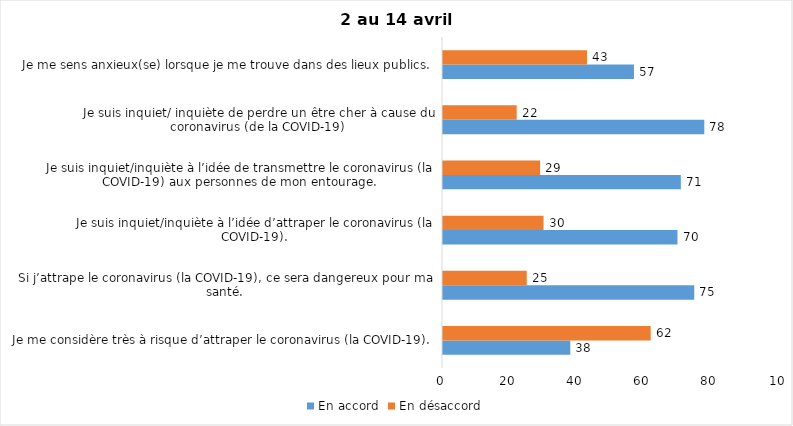
| Category | En accord | En désaccord |
|---|---|---|
| Je me considère très à risque d’attraper le coronavirus (la COVID-19). | 38 | 62 |
| Si j’attrape le coronavirus (la COVID-19), ce sera dangereux pour ma santé. | 75 | 25 |
| Je suis inquiet/inquiète à l’idée d’attraper le coronavirus (la COVID-19). | 70 | 30 |
| Je suis inquiet/inquiète à l’idée de transmettre le coronavirus (la COVID-19) aux personnes de mon entourage. | 71 | 29 |
| Je suis inquiet/ inquiète de perdre un être cher à cause du coronavirus (de la COVID-19) | 78 | 22 |
| Je me sens anxieux(se) lorsque je me trouve dans des lieux publics. | 57 | 43 |